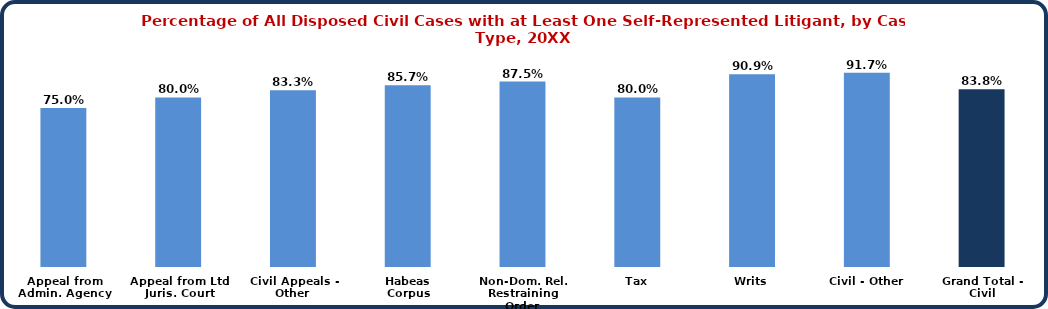
| Category | Series 0 |
|---|---|
| Appeal from
Admin. Agency | 0.75 |
| Appeal from Ltd
Juris. Court | 0.8 |
| Civil Appeals -
Other | 0.833 |
| Habeas
Corpus | 0.857 |
| Non-Dom. Rel.
Restraining Order | 0.875 |
| Tax | 0.8 |
| Writs | 0.909 |
| Civil - Other | 0.917 |
| Grand Total - Civil | 0.838 |